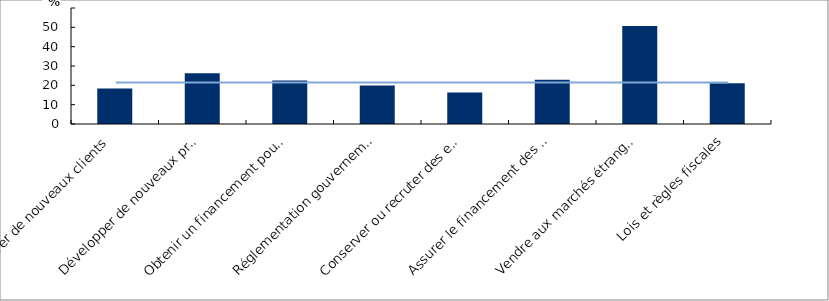
| Category | share_trade_by_chll |
|---|---|
| Attirer de nouveaux clients | 18.326 |
| Développer de nouveaux produits ou innovations | 26.3 |
| Obtenir un financement pour faire croître l'entreprise | 22.546 |
| Réglementation gouvernementale | 19.93 |
| Conserver ou recruter des employés qualifiés | 16.297 |
| Assurer le financement des activités courantes | 22.908 |
| Vendre aux marchés étrangers | 50.702 |
| Lois et règles fiscales | 21.031 |